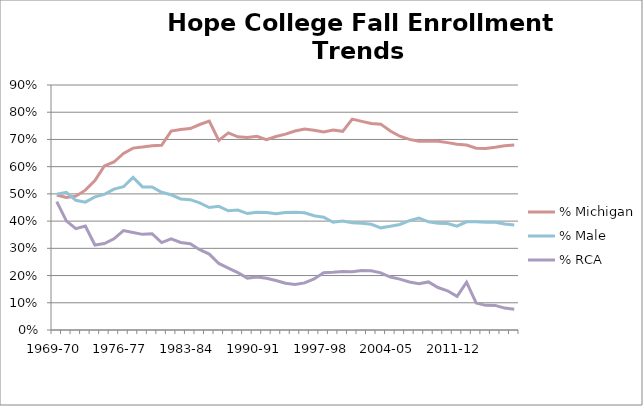
| Category | % Michigan | % Male | % RCA |
|---|---|---|---|
| 1969-70 | 0.496 | 0.499 | 0.472 |
| 1970-71 | 0.487 | 0.506 | 0.401 |
| 1971-72 | 0.492 | 0.476 | 0.372 |
| 1972-73 | 0.514 | 0.47 | 0.382 |
| 1973-74 | 0.549 | 0.489 | 0.312 |
| 1974-75 | 0.603 | 0.498 | 0.318 |
| 1975-76 | 0.617 | 0.517 | 0.335 |
| 1976-77 | 0.648 | 0.526 | 0.365 |
| 1977-78 | 0.668 | 0.561 | 0.358 |
| 1978-79 | 0.672 | 0.526 | 0.351 |
| 1979-80 | 0.676 | 0.526 | 0.354 |
| 1980-81 | 0.679 | 0.506 | 0.321 |
| 1981-82 | 0.731 | 0.497 | 0.334 |
| 1982-83 | 0.737 | 0.482 | 0.322 |
| 1983-84 | 0.74 | 0.479 | 0.317 |
| 1984-85 | 0.755 | 0.467 | 0.295 |
| 1985-86 | 0.768 | 0.45 | 0.279 |
| 1986-87 | 0.697 | 0.454 | 0.244 |
| 1987-88 | 0.724 | 0.438 | 0.227 |
| 1988-89 | 0.71 | 0.44 | 0.211 |
| 1989-90 | 0.707 | 0.428 | 0.191 |
| 1990-91 | 0.711 | 0.433 | 0.194 |
| 1991-92 | 0.699 | 0.432 | 0.19 |
| 1992-93 | 0.711 | 0.427 | 0.182 |
| 1993-94 | 0.719 | 0.432 | 0.172 |
| 1994-95 | 0.731 | 0.432 | 0.167 |
| 1995-96 | 0.739 | 0.431 | 0.173 |
| 1996-97 | 0.734 | 0.42 | 0.187 |
| 1997-98 | 0.728 | 0.414 | 0.211 |
| 1998-99 | 0.735 | 0.396 | 0.212 |
| 1999-00 | 0.73 | 0.4 | 0.215 |
| 2000-01 | 0.775 | 0.394 | 0.214 |
| 2001-02 | 0.766 | 0.393 | 0.218 |
| 2002-03 | 0.758 | 0.388 | 0.217 |
| 2003-04 | 0.756 | 0.375 | 0.21 |
| 2004-05 | 0.731 | 0.381 | 0.194 |
| 2005-06 | 0.712 | 0.388 | 0.187 |
| 2006-07 | 0.7 | 0.401 | 0.176 |
| 2007-08 | 0.693 | 0.411 | 0.17 |
| 2008-09 | 0.695 | 0.397 | 0.177 |
| 2009-10 | 0.693 | 0.392 | 0.156 |
| 2010-11 | 0.688 | 0.391 | 0.144 |
| 2011-12 | 0.682 | 0.381 | 0.123 |
| 2012-13 | 0.68 | 0.398 | 0.176 |
| 2013-14 | 0.668 | 0.398 | 0.099 |
| 2014-15 | 0.667 | 0.395 | 0.091 |
| 2015-16 | 0.671 | 0.396 | 0.09 |
| 2016-17 | 0.677 | 0.389 | 0.08 |
| 2017-18 | 0.68 | 0.385 | 0.077 |